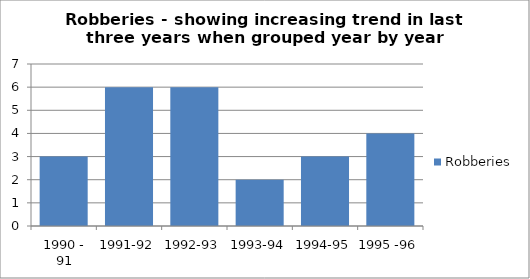
| Category | Robberies |
|---|---|
| 1990 - 91 | 3 |
| 1991-92 | 6 |
| 1992-93 | 6 |
| 1993-94 | 2 |
| 1994-95 | 3 |
| 1995 -96 | 4 |